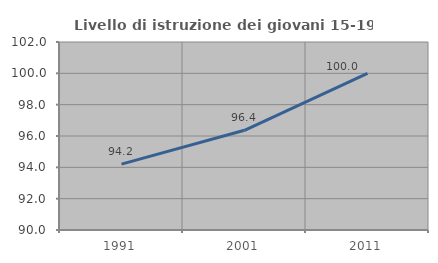
| Category | Livello di istruzione dei giovani 15-19 anni |
|---|---|
| 1991.0 | 94.203 |
| 2001.0 | 96.364 |
| 2011.0 | 100 |